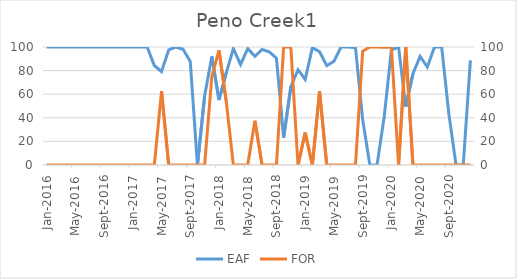
| Category | EAF |
|---|---|
| 2016-01-01 | 100 |
| 2016-02-01 | 100 |
| 2016-03-01 | 100 |
| 2016-04-01 | 100 |
| 2016-05-01 | 100 |
| 2016-06-01 | 100 |
| 2016-07-01 | 100 |
| 2016-08-01 | 100 |
| 2016-09-01 | 100 |
| 2016-10-01 | 100 |
| 2016-11-01 | 100 |
| 2016-12-01 | 100 |
| 2017-01-01 | 100 |
| 2017-02-01 | 100 |
| 2017-03-01 | 100 |
| 2017-04-01 | 84.32 |
| 2017-05-01 | 79.06 |
| 2017-06-01 | 97.64 |
| 2017-07-01 | 100 |
| 2017-08-01 | 98.03 |
| 2017-09-01 | 87.78 |
| 2017-10-01 | 0 |
| 2017-11-01 | 58.5 |
| 2017-12-01 | 92 |
| 2018-01-01 | 55.11 |
| 2018-02-01 | 77.82 |
| 2018-03-01 | 98.57 |
| 2018-04-01 | 85.14 |
| 2018-05-01 | 98.69 |
| 2018-06-01 | 92.11 |
| 2018-07-01 | 97.87 |
| 2018-08-01 | 95.83 |
| 2018-09-01 | 90.51 |
| 2018-10-01 | 23.11 |
| 2018-11-01 | 66.37 |
| 2018-12-01 | 80.7 |
| 2019-01-01 | 72.55 |
| 2019-02-01 | 99.45 |
| 2019-03-01 | 95.99 |
| 2019-04-01 | 84.21 |
| 2019-05-01 | 87.89 |
| 2019-06-01 | 100 |
| 2019-07-01 | 100 |
| 2019-08-01 | 99.46 |
| 2019-09-01 | 38.63 |
| 2019-10-01 | 0 |
| 2019-11-01 | 0 |
| 2019-12-01 | 40.89 |
| 2020-01-01 | 97.59 |
| 2020-02-01 | 100 |
| 2020-03-01 | 49.4 |
| 2020-04-01 | 77.44 |
| 2020-05-01 | 91.99 |
| 2020-06-01 | 83.02 |
| 2020-07-01 | 100 |
| 2020-08-01 | 100 |
| 2020-09-01 | 43.33 |
| 2020-10-01 | 0 |
| 2020-11-01 | 0 |
| 2020-12-01 | 88.63 |